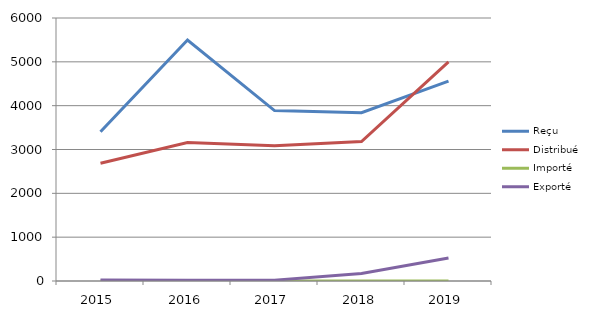
| Category | Reçu | Distribué | Importé | Exporté |
|---|---|---|---|---|
| 2015.0 | 3407 | 2687 | 0 | 25 |
| 2016.0 | 5498 | 3159 | 0 | 17 |
| 2017.0 | 3887 | 3088 | 0 | 19 |
| 2018.0 | 3841 | 3182 | 0 | 172 |
| 2019.0 | 4560 | 5001 | 0 | 523 |